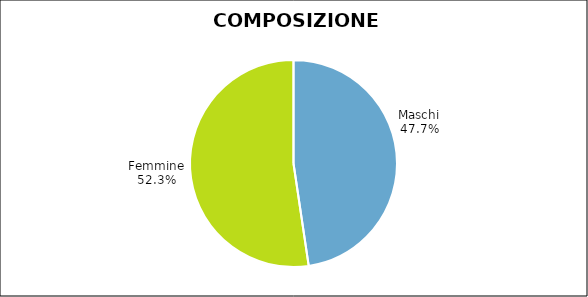
| Category | Series 0 |
|---|---|
| Maschi | 5275 |
| Femmine | 5795 |